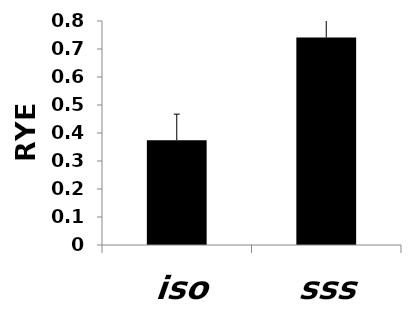
| Category | Series 0 |
|---|---|
| iso | 0.374 |
| sss | 0.741 |